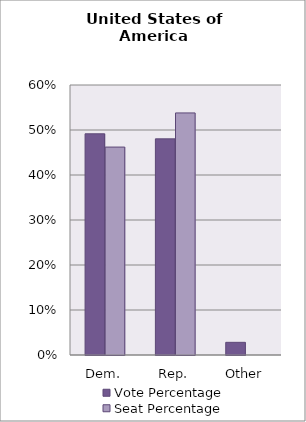
| Category | Vote Percentage | Seat Percentage |
|---|---|---|
| 0 | 0.492 | 0.462 |
| 1 | 0.48 | 0.538 |
| 2 | 0.028 | 0 |